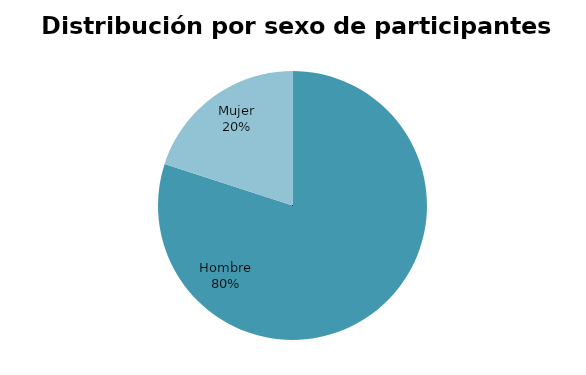
| Category | Series 0 |
|---|---|
| Hombre | 4 |
| Mujer | 1 |